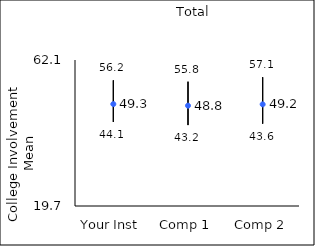
| Category | 25th percentile | 75th percentile | Mean |
|---|---|---|---|
| Your Inst | 44.1 | 56.2 | 49.3 |
| Comp 1 | 43.2 | 55.8 | 48.84 |
| Comp 2 | 43.6 | 57.1 | 49.22 |